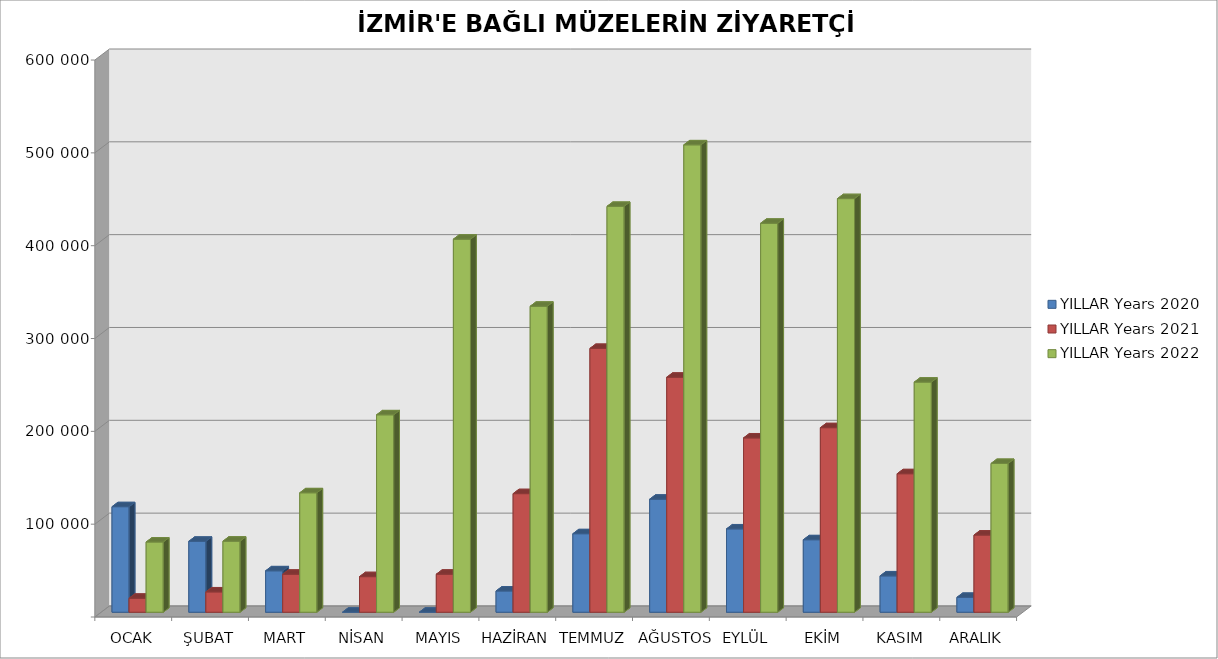
| Category | YILLAR |
|---|---|
| OCAK | 75648 |
| ŞUBAT | 76569 |
| MART | 128664 |
| NİSAN | 212657 |
| MAYIS | 401887 |
| HAZİRAN | 329617 |
| TEMMUZ | 437234 |
| AĞUSTOS | 503510 |
| EYLÜL | 419015 |
| EKİM | 445562 |
| KASIM | 247891 |
| ARALIK | 160286 |